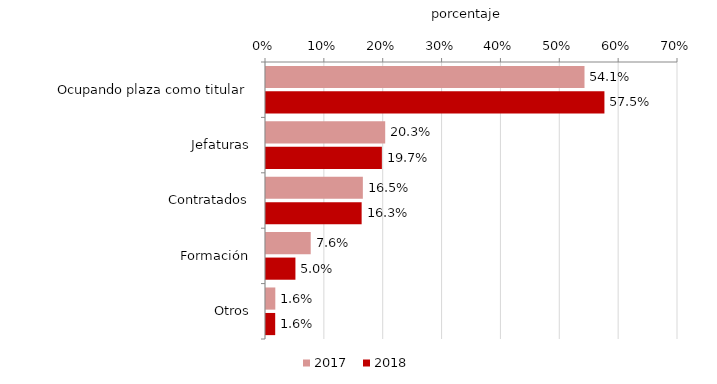
| Category | 2017 | 2018 |
|---|---|---|
| Ocupando plaza como titular | 0.541 | 0.575 |
| Jefaturas | 0.203 | 0.197 |
| Contratados | 0.165 | 0.162 |
| Formación | 0.076 | 0.05 |
| Otros | 0.016 | 0.016 |